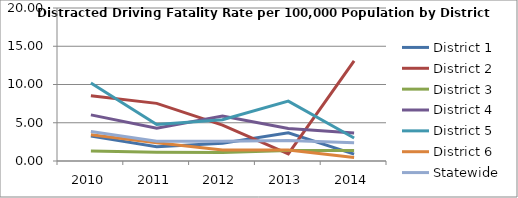
| Category | District 1 | District 2 | District 3 | District 4 | District 5 | District 6 | Statewide |
|---|---|---|---|---|---|---|---|
| 2010.0 | 3.253 | 8.538 | 1.312 | 6.032 | 10.207 | 3.423 | 3.847 |
| 2011.0 | 1.864 | 7.532 | 1.142 | 4.278 | 4.781 | 2.389 | 2.587 |
| 2012.0 | 2.321 | 4.695 | 1.126 | 5.877 | 5.397 | 1.432 | 2.569 |
| 2013.0 | 3.677 | 0.938 | 1.384 | 4.236 | 7.825 | 1.425 | 2.667 |
| 2014.0 | 0.903 | 13.08 | 1.357 | 3.675 | 3.008 | 0.471 | 2.386 |